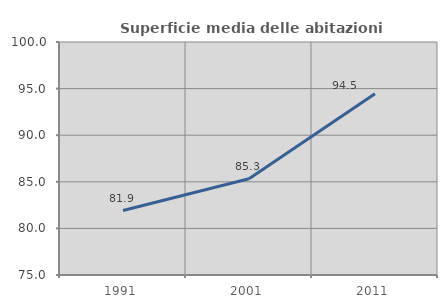
| Category | Superficie media delle abitazioni occupate |
|---|---|
| 1991.0 | 81.918 |
| 2001.0 | 85.325 |
| 2011.0 | 94.454 |